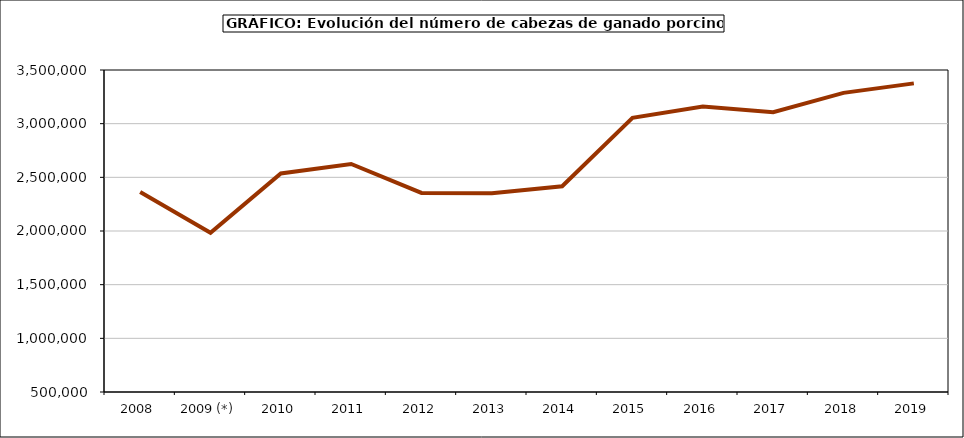
| Category | Total porcino |
|---|---|
| 2008 | 2362406.6 |
| 2009 (*) | 1983218.02 |
| 2010 | 2536564 |
| 2011 | 2624006 |
| 2012 | 2354690 |
| 2013 | 2351566 |
| 2014 | 2416557.46 |
| 2015 | 3053965.076 |
| 2016 | 3158719.951 |
| 2017 | 3106767.464 |
| 2018 | 3287091.287 |
| 2019 | 3375280.572 |